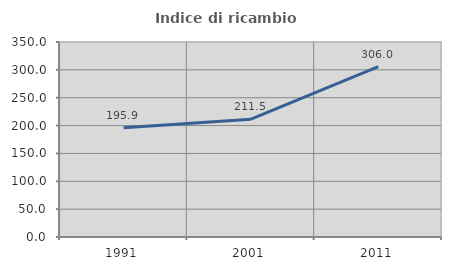
| Category | Indice di ricambio occupazionale  |
|---|---|
| 1991.0 | 195.89 |
| 2001.0 | 211.538 |
| 2011.0 | 306 |